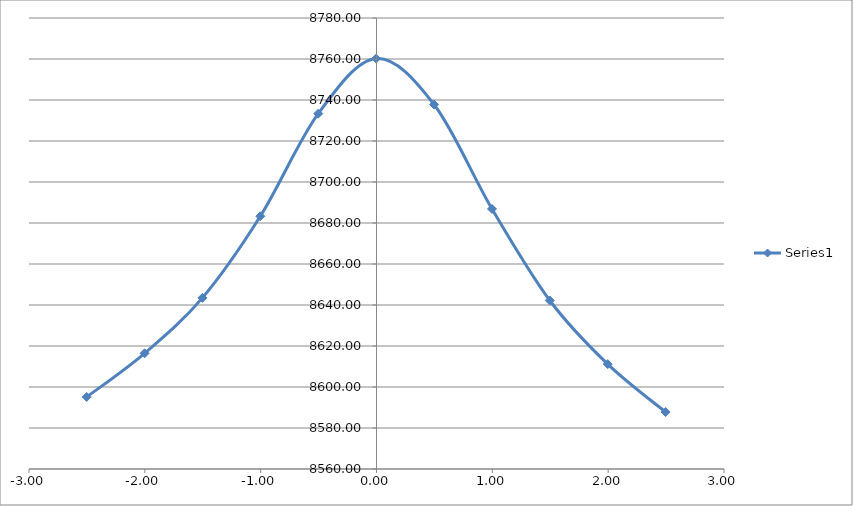
| Category | Series 0 |
|---|---|
| -2.502 | 8595.142 |
| -2.002 | 8616.44 |
| -1.5030000000000001 | 8643.479 |
| -1.0030000000000001 | 8683.289 |
| -0.5030000000000001 | 8733.33 |
| -0.0030000000000001137 | 8760.217 |
| 0.4969999999999999 | 8737.788 |
| 0.9969999999999999 | 8686.852 |
| 1.4959999999999996 | 8642.196 |
| 1.9959999999999996 | 8611.168 |
| 2.4959999999999996 | 8587.769 |